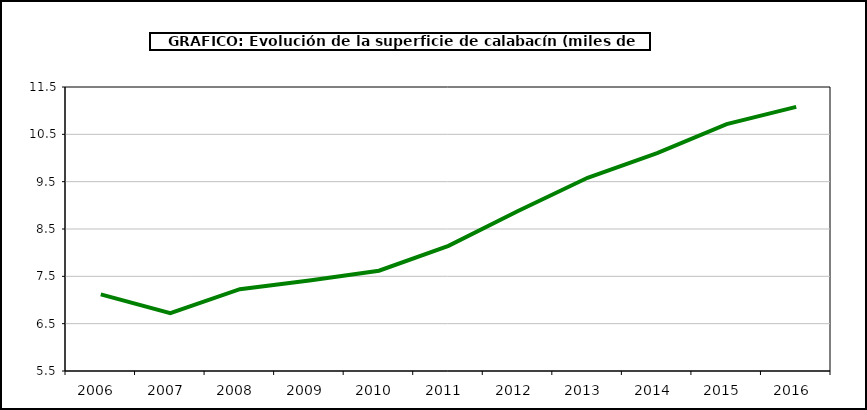
| Category | superficie |
|---|---|
| 2006.0 | 7.118 |
| 2007.0 | 6.724 |
| 2008.0 | 7.229 |
| 2009.0 | 7.41 |
| 2010.0 | 7.618 |
| 2011.0 | 8.144 |
| 2012.0 | 8.879 |
| 2013.0 | 9.582 |
| 2014.0 | 10.102 |
| 2015.0 | 10.717 |
| 2016.0 | 11.081 |